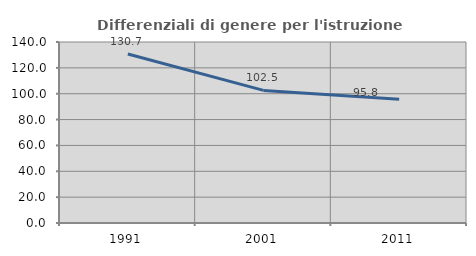
| Category | Differenziali di genere per l'istruzione superiore |
|---|---|
| 1991.0 | 130.683 |
| 2001.0 | 102.546 |
| 2011.0 | 95.801 |